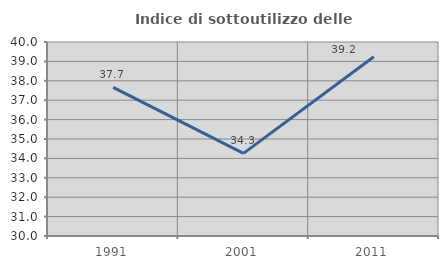
| Category | Indice di sottoutilizzo delle abitazioni  |
|---|---|
| 1991.0 | 37.662 |
| 2001.0 | 34.258 |
| 2011.0 | 39.24 |